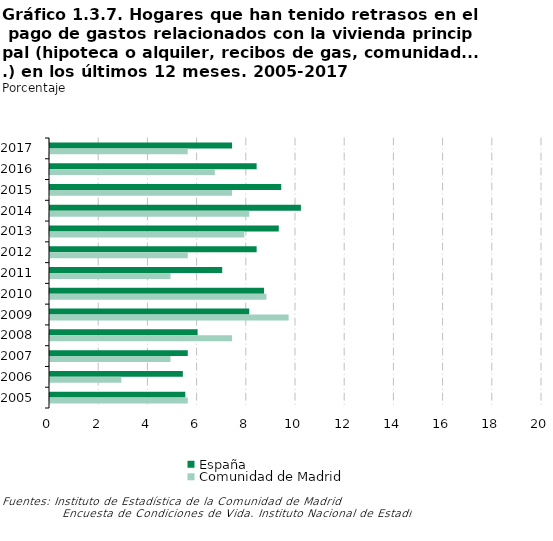
| Category | España | Comunidad de Madrid |
|---|---|---|
| 2017 | 7.4 | 5.6 |
| 2016 | 8.4 | 6.7 |
| 2015 | 9.4 | 7.4 |
| 2014 | 10.2 | 8.1 |
| 2013 | 9.3 | 7.9 |
| 2012 | 8.4 | 5.6 |
| 2011 | 7 | 4.9 |
| 2010 | 8.7 | 8.8 |
| 2009 | 8.1 | 9.7 |
| 2008 | 6 | 7.4 |
| 2007 | 5.6 | 4.9 |
| 2006 | 5.4 | 2.9 |
| 2005 | 5.5 | 5.6 |